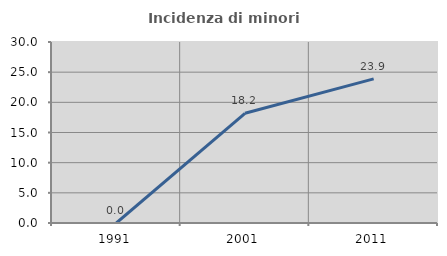
| Category | Incidenza di minori stranieri |
|---|---|
| 1991.0 | 0 |
| 2001.0 | 18.182 |
| 2011.0 | 23.894 |